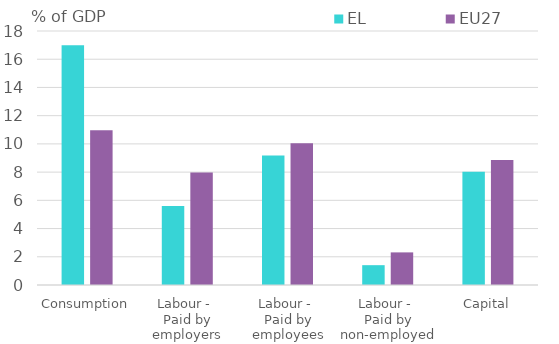
| Category | EL | EU27 |
|---|---|---|
| Consumption | 16.999 | 10.967 |
| Labour - 
Paid by employers | 5.598 | 7.966 |
| Labour - 
Paid by employees | 9.179 | 10.052 |
| Labour - 
Paid by non-employed | 1.405 | 2.311 |
| Capital | 8.031 | 8.858 |